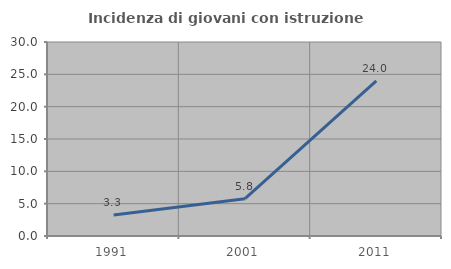
| Category | Incidenza di giovani con istruzione universitaria |
|---|---|
| 1991.0 | 3.261 |
| 2001.0 | 5.769 |
| 2011.0 | 24 |